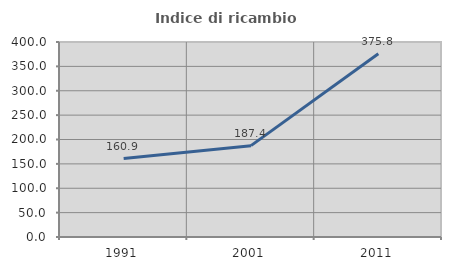
| Category | Indice di ricambio occupazionale  |
|---|---|
| 1991.0 | 160.851 |
| 2001.0 | 187.379 |
| 2011.0 | 375.758 |